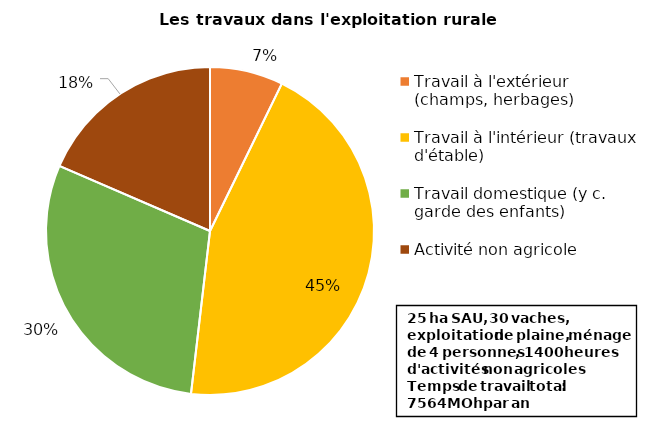
| Category | Series 0 |
|---|---|
| Travail à l'extérieur (champs, herbages) | 546 |
| Travail à l'intérieur (travaux d'étable) | 3376 |
| Travail domestique (y c. garde des enfants) | 2242 |
| Activité non agricole | 1400 |